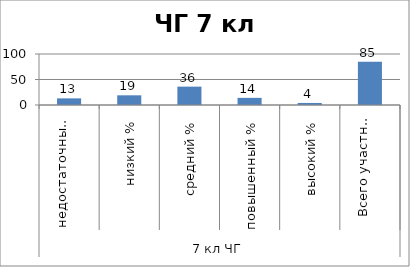
| Category | Series 0 |
|---|---|
| 0 | 13 |
| 1 | 19 |
| 2 | 36 |
| 3 | 14 |
| 4 | 4 |
| 5 | 85 |